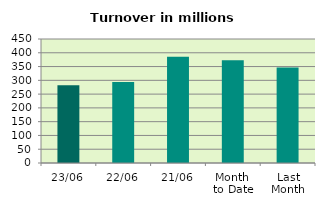
| Category | Series 0 |
|---|---|
| 23/06 | 282.443 |
| 22/06 | 294.193 |
| 21/06 | 385.791 |
| Month 
to Date | 372.619 |
| Last
Month | 346.329 |